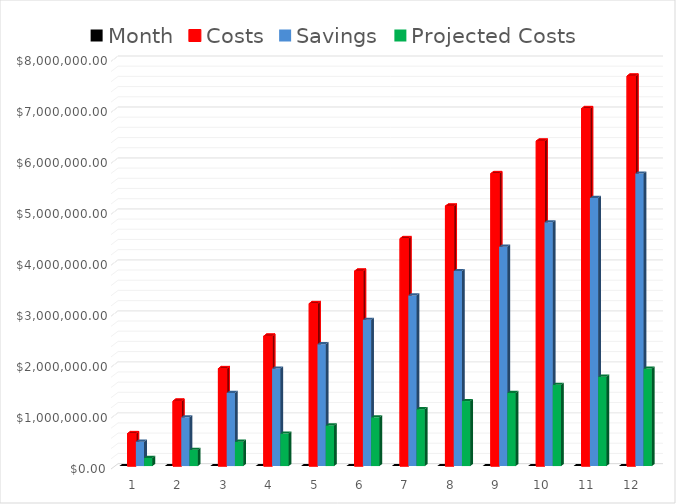
| Category | Month | Costs | Savings | Projected Costs |
|---|---|---|---|---|
| 0 | 1 | 637841.842 | 478381.382 | 159460.461 |
| 1 | 2 | 1275683.684 | 956762.763 | 318920.921 |
| 2 | 3 | 1913525.526 | 1435144.145 | 478381.382 |
| 3 | 4 | 2551367.368 | 1913525.526 | 637841.842 |
| 4 | 5 | 3189209.21 | 2391906.908 | 797302.303 |
| 5 | 6 | 3827051.052 | 2870288.289 | 956762.763 |
| 6 | 7 | 4464892.894 | 3348669.671 | 1116223.224 |
| 7 | 8 | 5102734.736 | 3827051.052 | 1275683.684 |
| 8 | 9 | 5740576.578 | 4305432.434 | 1435144.145 |
| 9 | 10 | 6378418.42 | 4783813.815 | 1594604.605 |
| 10 | 11 | 7016260.262 | 5262195.197 | 1754065.066 |
| 11 | 12 | 7654102.104 | 5740576.578 | 1913525.526 |